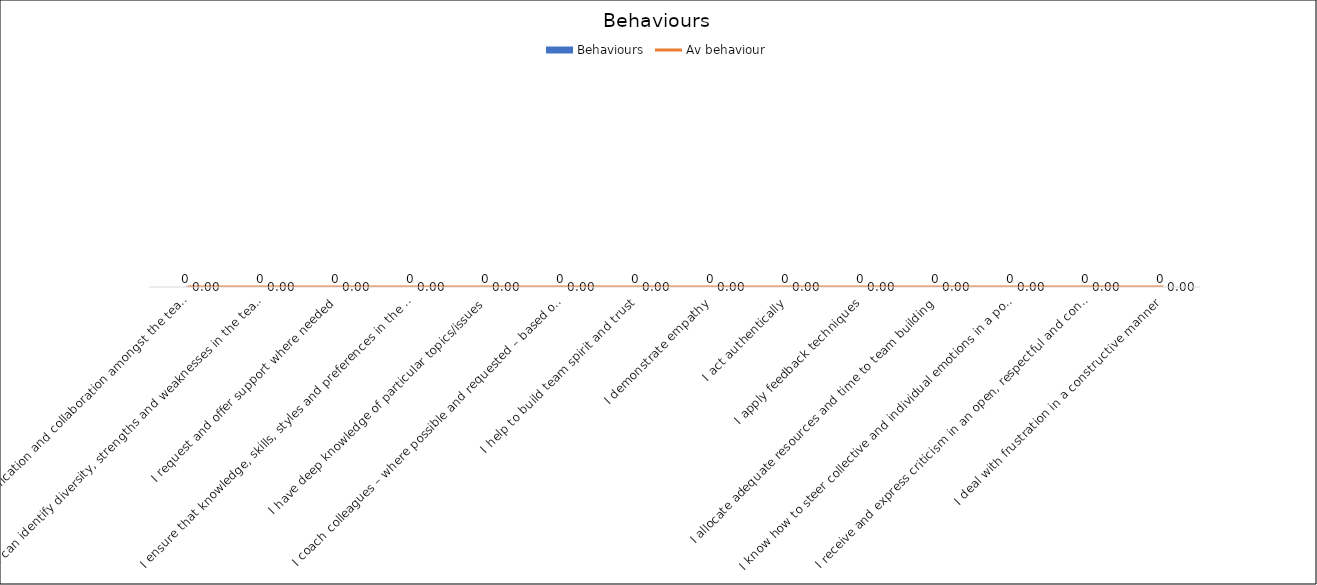
| Category | Behaviours |
|---|---|
| I promote communication and collaboration amongst the team members to nurture qualities and deal with resistance | 0 |
| I can identify diversity, strengths and weaknesses in the team  | 0 |
| I request and offer support where needed | 0 |
| I ensure that knowledge, skills, styles and preferences in the team are shared and communicated | 0 |
| I have deep knowledge of particular topics/issues | 0 |
| I coach colleagues – where possible and requested – based on the approach of non-formal learning | 0 |
| I help to build team spirit and trust | 0 |
| I demonstrate empathy | 0 |
| I act authentically | 0 |
| I apply feedback techniques | 0 |
| I allocate adequate resources and time to team building | 0 |
| I know how to steer collective and individual emotions in a positive direction | 0 |
| I receive and express criticism in an open, respectful and constructive way | 0 |
| I deal with frustration in a constructive manner | 0 |